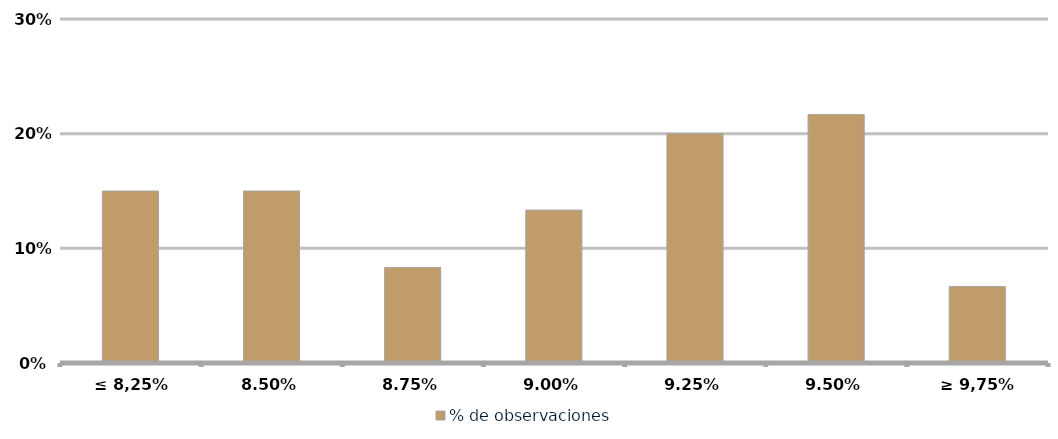
| Category | % de observaciones  |
|---|---|
| ≤ 8,25% | 0.15 |
| 8,50% | 0.15 |
| 8,75% | 0.083 |
| 9,00% | 0.133 |
| 9,25% | 0.2 |
| 9,50% | 0.217 |
| ≥ 9,75% | 0.067 |